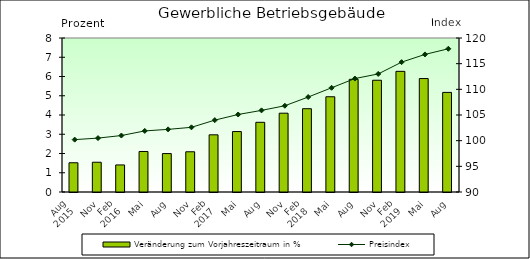
| Category | Veränderung zum Vorjahreszeitraum in % |
|---|---|
| 0 | 1.519 |
| 1 | 1.546 |
| 2 | 1.406 |
| 3 | 2.104 |
| 4 | 1.996 |
| 5 | 2.09 |
| 6 | 2.97 |
| 7 | 3.14 |
| 8 | 3.62 |
| 9 | 4.094 |
| 10 | 4.327 |
| 11 | 4.948 |
| 12 | 5.855 |
| 13 | 5.805 |
| 14 | 6.267 |
| 15 | 5.893 |
| 16 | 5.174 |